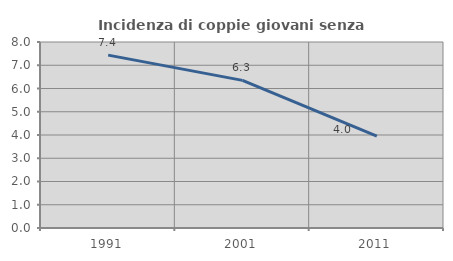
| Category | Incidenza di coppie giovani senza figli |
|---|---|
| 1991.0 | 7.437 |
| 2001.0 | 6.349 |
| 2011.0 | 3.952 |